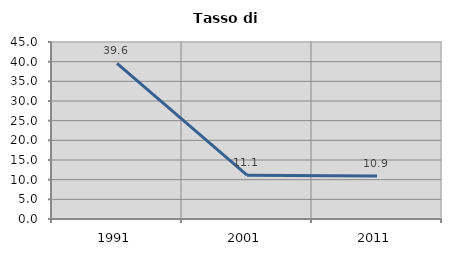
| Category | Tasso di disoccupazione   |
|---|---|
| 1991.0 | 39.593 |
| 2001.0 | 11.15 |
| 2011.0 | 10.918 |